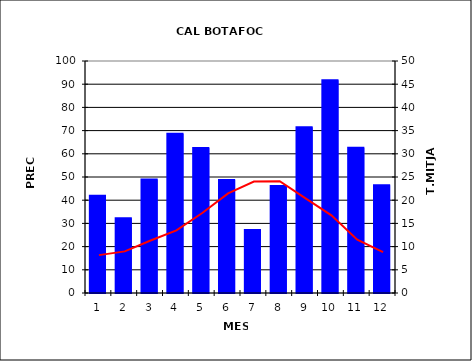
| Category | Series 0 |
|---|---|
| 0 | 41.955 |
| 1 | 32.168 |
| 2 | 48.929 |
| 3 | 68.629 |
| 4 | 62.468 |
| 5 | 48.677 |
| 6 | 27.129 |
| 7 | 46.135 |
| 8 | 71.49 |
| 9 | 91.677 |
| 10 | 62.561 |
| 11 | 46.462 |